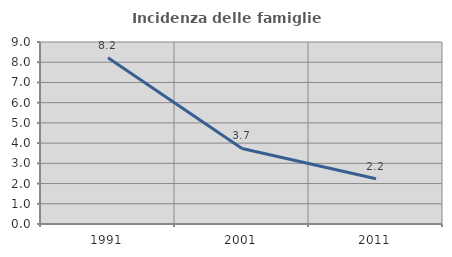
| Category | Incidenza delle famiglie numerose |
|---|---|
| 1991.0 | 8.216 |
| 2001.0 | 3.734 |
| 2011.0 | 2.24 |